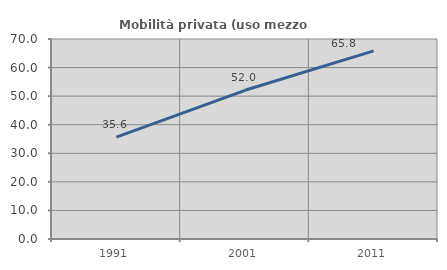
| Category | Mobilità privata (uso mezzo privato) |
|---|---|
| 1991.0 | 35.628 |
| 2001.0 | 52.042 |
| 2011.0 | 65.821 |